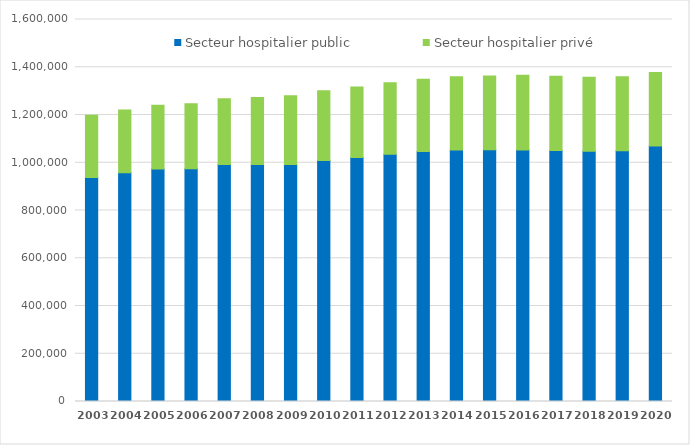
| Category | Secteur hospitalier public | Secteur hospitalier privé |
|---|---|---|
| 2003.0 | 938029 | 260491 |
| 2004.0 | 958479.5 | 262921 |
| 2005.0 | 973633 | 267066 |
| 2006.0 | 975001 | 272152 |
| 2007.0 | 992882 | 275576 |
| 2008.0 | 992454 | 280626 |
| 2009.0 | 992863 | 287906 |
| 2010.0 | 1009469 | 292335 |
| 2011.0 | 1022386 | 294942 |
| 2012.0 | 1035756.5 | 299317 |
| 2013.0 | 1046984 | 303107 |
| 2014.0 | 1053661 | 307001 |
| 2015.0 | 1054546 | 308753 |
| 2016.0 | 1053194 | 313784 |
| 2017.0 | 1051282 | 311438 |
| 2018.0 | 1048366 | 309246 |
| 2019.0 | 1050578 | 309118 |
| 2020.0 | 1070446 | 307635 |